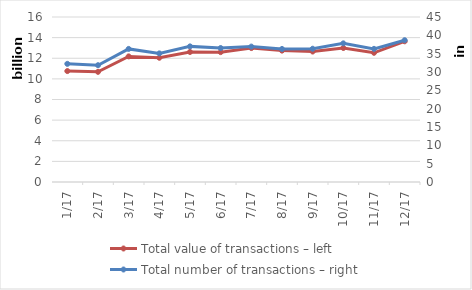
| Category | Total value of transactions – left |
|---|---|
| 2017-01-01 | 10757215830 |
| 2017-02-01 | 10682396973 |
| 2017-03-01 | 12180044128 |
| 2017-04-01 | 12048858960 |
| 2017-05-01 | 12610038994 |
| 2017-06-01 | 12593003292 |
| 2017-07-01 | 12989278288 |
| 2017-08-01 | 12741369869 |
| 2017-09-01 | 12650799703 |
| 2017-10-01 | 12994325285 |
| 2017-11-01 | 12529124251 |
| 2017-12-01 | 13644071358 |